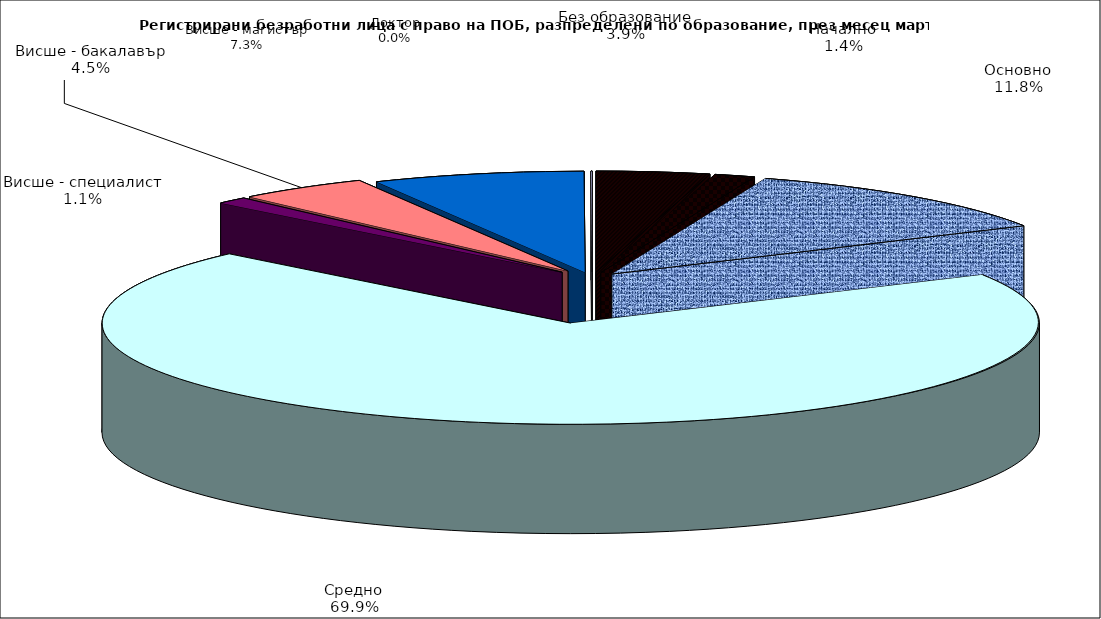
| Category | Series 0 |
|---|---|
| Без образование | 2217 |
| Начално | 794 |
| Основно | 6666 |
| Средно | 39616 |
| Висше - специалист | 624 |
| Висше - бакалавър | 2574 |
| Висше - магистър | 4138 |
| Доктор | 23 |